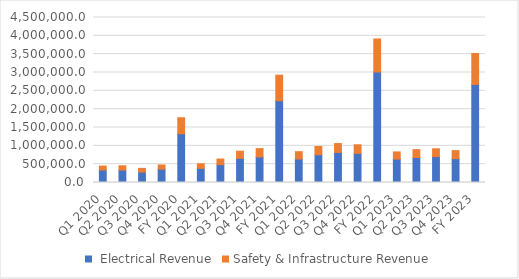
| Category |  Electrical Revenue | Safety & Infrastructure Revenue |
|---|---|---|
| Q1 2020 | 340788 | 106660 |
| Q2 2020 | 339005 | 116649 |
| Q3 2020 | 285412 | 99487 |
| Q4 2020 | 364148 | 113904 |
| FY 2020 | 1329353 | 436700 |
| Q1 2021 | 386320 | 124762 |
| Q2 2021 | 486924 | 152619 |
| Q3 2021 | 660198 | 193460 |
| Q4 2021 | 697492 | 226239 |
| FY 2021 | 2230934 | 697080 |
| Q1 2022 | 640344 | 200457 |
| Q2 2022 | 758347 | 224226 |
| Q3 2022 | 819845 | 241745 |
| Q4 2022 | 795219 | 233768 |
| FY 2022 | 3013755 | 900196 |
| Q1 2023 | 638705 | 195116 |
| Q2 2023 | 680955 | 214979 |
| Q3 2023 | 705603 | 213514 |
| Q4 2023 | 649787 | 220102 |
| FY 2023 | 2675050 | 843711 |